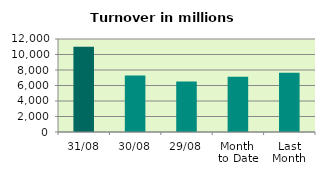
| Category | Series 0 |
|---|---|
| 31/08 | 10984.016 |
| 30/08 | 7275.502 |
| 29/08 | 6509.664 |
| Month 
to Date | 7128.729 |
| Last
Month | 7648.819 |